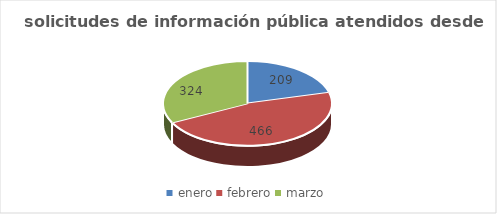
| Category | Series 0 |
|---|---|
| enero | 209 |
| febrero | 466 |
| marzo | 324 |